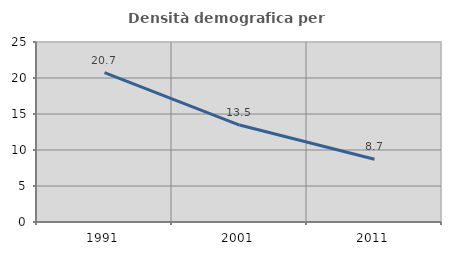
| Category | Densità demografica |
|---|---|
| 1991.0 | 20.744 |
| 2001.0 | 13.462 |
| 2011.0 | 8.721 |